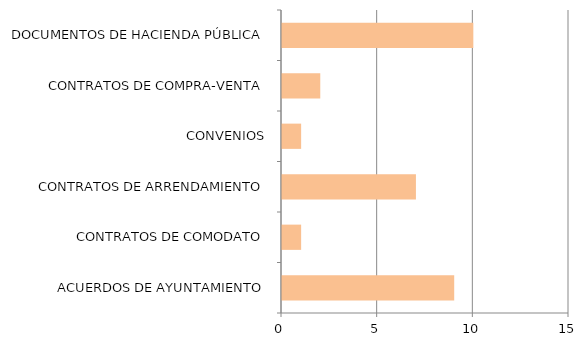
| Category | Series 0 |
|---|---|
| ACUERDOS DE AYUNTAMIENTO | 9 |
| CONTRATOS DE COMODATO | 1 |
| CONTRATOS DE ARRENDAMIENTO | 7 |
| CONVENIOS | 1 |
| CONTRATOS DE COMPRA-VENTA | 2 |
| DOCUMENTOS DE HACIENDA PÚBLICA | 10 |